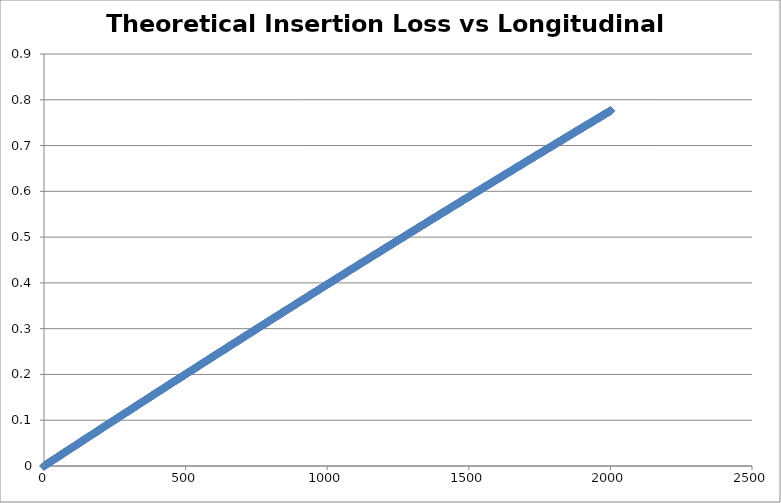
| Category | Theoretical Insertion Loss for 200um fiber |
|---|---|
| 0.0 | 0 |
| 5.0 | 0.002 |
| 10.0 | 0.004 |
| 15.0 | 0.006 |
| 20.0 | 0.008 |
| 25.0 | 0.01 |
| 30.0 | 0.012 |
| 35.0 | 0.014 |
| 40.0 | 0.016 |
| 45.0 | 0.018 |
| 50.0 | 0.02 |
| 55.0 | 0.022 |
| 60.0 | 0.024 |
| 65.0 | 0.026 |
| 70.0 | 0.028 |
| 75.0 | 0.03 |
| 80.0 | 0.032 |
| 85.0 | 0.034 |
| 90.0 | 0.036 |
| 95.0 | 0.038 |
| 100.0 | 0.04 |
| 105.0 | 0.043 |
| 110.0 | 0.045 |
| 115.0 | 0.047 |
| 120.0 | 0.049 |
| 125.0 | 0.051 |
| 130.0 | 0.053 |
| 135.0 | 0.055 |
| 140.0 | 0.057 |
| 145.0 | 0.059 |
| 150.0 | 0.061 |
| 155.0 | 0.063 |
| 160.0 | 0.065 |
| 165.0 | 0.067 |
| 170.0 | 0.069 |
| 175.0 | 0.071 |
| 180.0 | 0.073 |
| 185.0 | 0.075 |
| 190.0 | 0.077 |
| 195.0 | 0.079 |
| 200.0 | 0.081 |
| 205.0 | 0.083 |
| 210.0 | 0.085 |
| 215.0 | 0.087 |
| 220.0 | 0.089 |
| 225.0 | 0.091 |
| 230.0 | 0.093 |
| 235.0 | 0.095 |
| 240.0 | 0.097 |
| 245.0 | 0.099 |
| 250.0 | 0.101 |
| 255.0 | 0.103 |
| 260.0 | 0.105 |
| 265.0 | 0.107 |
| 270.0 | 0.109 |
| 275.0 | 0.111 |
| 280.0 | 0.113 |
| 285.0 | 0.115 |
| 290.0 | 0.117 |
| 295.0 | 0.119 |
| 300.0 | 0.121 |
| 305.0 | 0.123 |
| 310.0 | 0.125 |
| 315.0 | 0.127 |
| 320.0 | 0.129 |
| 325.0 | 0.131 |
| 330.0 | 0.133 |
| 335.0 | 0.135 |
| 340.0 | 0.137 |
| 345.0 | 0.139 |
| 350.0 | 0.141 |
| 355.0 | 0.143 |
| 360.0 | 0.145 |
| 365.0 | 0.147 |
| 370.0 | 0.149 |
| 375.0 | 0.151 |
| 380.0 | 0.153 |
| 385.0 | 0.155 |
| 390.0 | 0.157 |
| 395.0 | 0.159 |
| 400.0 | 0.161 |
| 405.0 | 0.163 |
| 410.0 | 0.165 |
| 415.0 | 0.167 |
| 420.0 | 0.169 |
| 425.0 | 0.171 |
| 430.0 | 0.173 |
| 435.0 | 0.175 |
| 440.0 | 0.177 |
| 445.0 | 0.179 |
| 450.0 | 0.181 |
| 455.0 | 0.183 |
| 460.0 | 0.185 |
| 465.0 | 0.187 |
| 470.0 | 0.189 |
| 475.0 | 0.191 |
| 480.0 | 0.193 |
| 485.0 | 0.195 |
| 490.0 | 0.197 |
| 495.0 | 0.199 |
| 500.0 | 0.201 |
| 505.0 | 0.203 |
| 510.0 | 0.205 |
| 515.0 | 0.206 |
| 520.0 | 0.208 |
| 525.0 | 0.21 |
| 530.0 | 0.212 |
| 535.0 | 0.214 |
| 540.0 | 0.216 |
| 545.0 | 0.218 |
| 550.0 | 0.22 |
| 555.0 | 0.222 |
| 560.0 | 0.224 |
| 565.0 | 0.226 |
| 570.0 | 0.228 |
| 575.0 | 0.23 |
| 580.0 | 0.232 |
| 585.0 | 0.234 |
| 590.0 | 0.236 |
| 595.0 | 0.238 |
| 600.0 | 0.24 |
| 605.0 | 0.242 |
| 610.0 | 0.244 |
| 615.0 | 0.246 |
| 620.0 | 0.248 |
| 625.0 | 0.25 |
| 630.0 | 0.252 |
| 635.0 | 0.254 |
| 640.0 | 0.256 |
| 645.0 | 0.258 |
| 650.0 | 0.26 |
| 655.0 | 0.262 |
| 660.0 | 0.264 |
| 665.0 | 0.266 |
| 670.0 | 0.268 |
| 675.0 | 0.27 |
| 680.0 | 0.272 |
| 685.0 | 0.274 |
| 690.0 | 0.276 |
| 695.0 | 0.278 |
| 700.0 | 0.279 |
| 705.0 | 0.281 |
| 710.0 | 0.283 |
| 715.0 | 0.285 |
| 720.0 | 0.287 |
| 725.0 | 0.289 |
| 730.0 | 0.291 |
| 735.0 | 0.293 |
| 740.0 | 0.295 |
| 745.0 | 0.297 |
| 750.0 | 0.299 |
| 755.0 | 0.301 |
| 760.0 | 0.303 |
| 765.0 | 0.305 |
| 770.0 | 0.307 |
| 775.0 | 0.309 |
| 780.0 | 0.311 |
| 785.0 | 0.313 |
| 790.0 | 0.315 |
| 795.0 | 0.317 |
| 800.0 | 0.319 |
| 805.0 | 0.321 |
| 810.0 | 0.323 |
| 815.0 | 0.325 |
| 820.0 | 0.327 |
| 825.0 | 0.328 |
| 830.0 | 0.33 |
| 835.0 | 0.332 |
| 840.0 | 0.334 |
| 845.0 | 0.336 |
| 850.0 | 0.338 |
| 855.0 | 0.34 |
| 860.0 | 0.342 |
| 865.0 | 0.344 |
| 870.0 | 0.346 |
| 875.0 | 0.348 |
| 880.0 | 0.35 |
| 885.0 | 0.352 |
| 890.0 | 0.354 |
| 895.0 | 0.356 |
| 900.0 | 0.358 |
| 905.0 | 0.36 |
| 910.0 | 0.362 |
| 915.0 | 0.364 |
| 920.0 | 0.365 |
| 925.0 | 0.367 |
| 930.0 | 0.369 |
| 935.0 | 0.371 |
| 940.0 | 0.373 |
| 945.0 | 0.375 |
| 950.0 | 0.377 |
| 955.0 | 0.379 |
| 960.0 | 0.381 |
| 965.0 | 0.383 |
| 970.0 | 0.385 |
| 975.0 | 0.387 |
| 980.0 | 0.389 |
| 985.0 | 0.391 |
| 990.0 | 0.393 |
| 995.0 | 0.395 |
| 1000.0 | 0.397 |
| 1005.0 | 0.399 |
| 1010.0 | 0.4 |
| 1015.0 | 0.402 |
| 1020.0 | 0.404 |
| 1025.0 | 0.406 |
| 1030.0 | 0.408 |
| 1035.0 | 0.41 |
| 1040.0 | 0.412 |
| 1045.0 | 0.414 |
| 1050.0 | 0.416 |
| 1055.0 | 0.418 |
| 1060.0 | 0.42 |
| 1065.0 | 0.422 |
| 1070.0 | 0.424 |
| 1075.0 | 0.426 |
| 1080.0 | 0.428 |
| 1085.0 | 0.429 |
| 1090.0 | 0.431 |
| 1095.0 | 0.433 |
| 1100.0 | 0.435 |
| 1105.0 | 0.437 |
| 1110.0 | 0.439 |
| 1115.0 | 0.441 |
| 1120.0 | 0.443 |
| 1125.0 | 0.445 |
| 1130.0 | 0.447 |
| 1135.0 | 0.449 |
| 1140.0 | 0.451 |
| 1145.0 | 0.453 |
| 1150.0 | 0.455 |
| 1155.0 | 0.456 |
| 1160.0 | 0.458 |
| 1165.0 | 0.46 |
| 1170.0 | 0.462 |
| 1175.0 | 0.464 |
| 1180.0 | 0.466 |
| 1185.0 | 0.468 |
| 1190.0 | 0.47 |
| 1195.0 | 0.472 |
| 1200.0 | 0.474 |
| 1205.0 | 0.476 |
| 1210.0 | 0.478 |
| 1215.0 | 0.48 |
| 1220.0 | 0.481 |
| 1225.0 | 0.483 |
| 1230.0 | 0.485 |
| 1235.0 | 0.487 |
| 1240.0 | 0.489 |
| 1245.0 | 0.491 |
| 1250.0 | 0.493 |
| 1255.0 | 0.495 |
| 1260.0 | 0.497 |
| 1265.0 | 0.499 |
| 1270.0 | 0.501 |
| 1275.0 | 0.503 |
| 1280.0 | 0.504 |
| 1285.0 | 0.506 |
| 1290.0 | 0.508 |
| 1295.0 | 0.51 |
| 1300.0 | 0.512 |
| 1305.0 | 0.514 |
| 1310.0 | 0.516 |
| 1315.0 | 0.518 |
| 1320.0 | 0.52 |
| 1325.0 | 0.522 |
| 1330.0 | 0.524 |
| 1335.0 | 0.525 |
| 1340.0 | 0.527 |
| 1345.0 | 0.529 |
| 1350.0 | 0.531 |
| 1355.0 | 0.533 |
| 1360.0 | 0.535 |
| 1365.0 | 0.537 |
| 1370.0 | 0.539 |
| 1375.0 | 0.541 |
| 1380.0 | 0.543 |
| 1385.0 | 0.545 |
| 1390.0 | 0.546 |
| 1395.0 | 0.548 |
| 1400.0 | 0.55 |
| 1405.0 | 0.552 |
| 1410.0 | 0.554 |
| 1415.0 | 0.556 |
| 1420.0 | 0.558 |
| 1425.0 | 0.56 |
| 1430.0 | 0.562 |
| 1435.0 | 0.564 |
| 1440.0 | 0.565 |
| 1445.0 | 0.567 |
| 1450.0 | 0.569 |
| 1455.0 | 0.571 |
| 1460.0 | 0.573 |
| 1465.0 | 0.575 |
| 1470.0 | 0.577 |
| 1475.0 | 0.579 |
| 1480.0 | 0.581 |
| 1485.0 | 0.583 |
| 1490.0 | 0.584 |
| 1495.0 | 0.586 |
| 1500.0 | 0.588 |
| 1505.0 | 0.59 |
| 1510.0 | 0.592 |
| 1515.0 | 0.594 |
| 1520.0 | 0.596 |
| 1525.0 | 0.598 |
| 1530.0 | 0.6 |
| 1535.0 | 0.602 |
| 1540.0 | 0.603 |
| 1545.0 | 0.605 |
| 1550.0 | 0.607 |
| 1555.0 | 0.609 |
| 1560.0 | 0.611 |
| 1565.0 | 0.613 |
| 1570.0 | 0.615 |
| 1575.0 | 0.617 |
| 1580.0 | 0.619 |
| 1585.0 | 0.62 |
| 1590.0 | 0.622 |
| 1595.0 | 0.624 |
| 1600.0 | 0.626 |
| 1605.0 | 0.628 |
| 1610.0 | 0.63 |
| 1615.0 | 0.632 |
| 1620.0 | 0.634 |
| 1625.0 | 0.636 |
| 1630.0 | 0.637 |
| 1635.0 | 0.639 |
| 1640.0 | 0.641 |
| 1645.0 | 0.643 |
| 1650.0 | 0.645 |
| 1655.0 | 0.647 |
| 1660.0 | 0.649 |
| 1665.0 | 0.651 |
| 1670.0 | 0.652 |
| 1675.0 | 0.654 |
| 1680.0 | 0.656 |
| 1685.0 | 0.658 |
| 1690.0 | 0.66 |
| 1695.0 | 0.662 |
| 1700.0 | 0.664 |
| 1705.0 | 0.666 |
| 1710.0 | 0.668 |
| 1715.0 | 0.669 |
| 1720.0 | 0.671 |
| 1725.0 | 0.673 |
| 1730.0 | 0.675 |
| 1735.0 | 0.677 |
| 1740.0 | 0.679 |
| 1745.0 | 0.681 |
| 1750.0 | 0.683 |
| 1755.0 | 0.684 |
| 1760.0 | 0.686 |
| 1765.0 | 0.688 |
| 1770.0 | 0.69 |
| 1775.0 | 0.692 |
| 1780.0 | 0.694 |
| 1785.0 | 0.696 |
| 1790.0 | 0.698 |
| 1795.0 | 0.699 |
| 1800.0 | 0.701 |
| 1805.0 | 0.703 |
| 1810.0 | 0.705 |
| 1815.0 | 0.707 |
| 1820.0 | 0.709 |
| 1825.0 | 0.711 |
| 1830.0 | 0.713 |
| 1835.0 | 0.714 |
| 1840.0 | 0.716 |
| 1845.0 | 0.718 |
| 1850.0 | 0.72 |
| 1855.0 | 0.722 |
| 1860.0 | 0.724 |
| 1865.0 | 0.726 |
| 1870.0 | 0.727 |
| 1875.0 | 0.729 |
| 1880.0 | 0.731 |
| 1885.0 | 0.733 |
| 1890.0 | 0.735 |
| 1895.0 | 0.737 |
| 1900.0 | 0.739 |
| 1905.0 | 0.74 |
| 1910.0 | 0.742 |
| 1915.0 | 0.744 |
| 1920.0 | 0.746 |
| 1925.0 | 0.748 |
| 1930.0 | 0.75 |
| 1935.0 | 0.752 |
| 1940.0 | 0.754 |
| 1945.0 | 0.755 |
| 1950.0 | 0.757 |
| 1955.0 | 0.759 |
| 1960.0 | 0.761 |
| 1965.0 | 0.763 |
| 1970.0 | 0.765 |
| 1975.0 | 0.767 |
| 1980.0 | 0.768 |
| 1985.0 | 0.77 |
| 1990.0 | 0.772 |
| 1995.0 | 0.774 |
| 2000.0 | 0.776 |